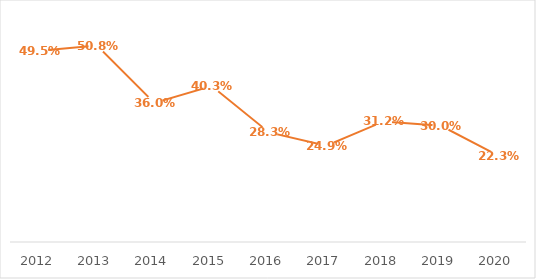
| Category | Series 0 |
|---|---|
| 2012.0 | 0.495 |
| 2013.0 | 0.508 |
| 2014.0 | 0.36 |
| 2015.0 | 0.403 |
| 2016.0 | 0.283 |
| 2017.0 | 0.249 |
| 2018.0 | 0.312 |
| 2019.0 | 0.3 |
| 2020.0 | 0.223 |